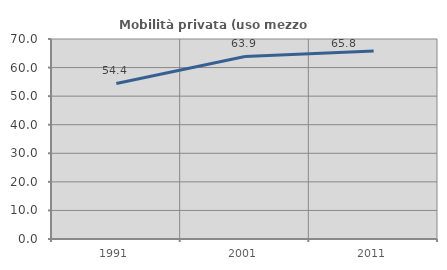
| Category | Mobilità privata (uso mezzo privato) |
|---|---|
| 1991.0 | 54.431 |
| 2001.0 | 63.887 |
| 2011.0 | 65.828 |